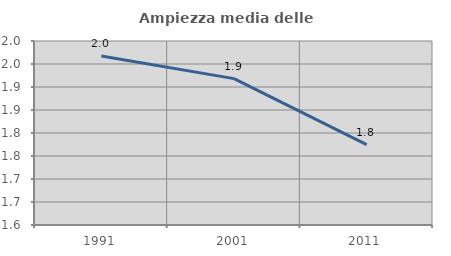
| Category | Ampiezza media delle famiglie |
|---|---|
| 1991.0 | 1.967 |
| 2001.0 | 1.918 |
| 2011.0 | 1.775 |